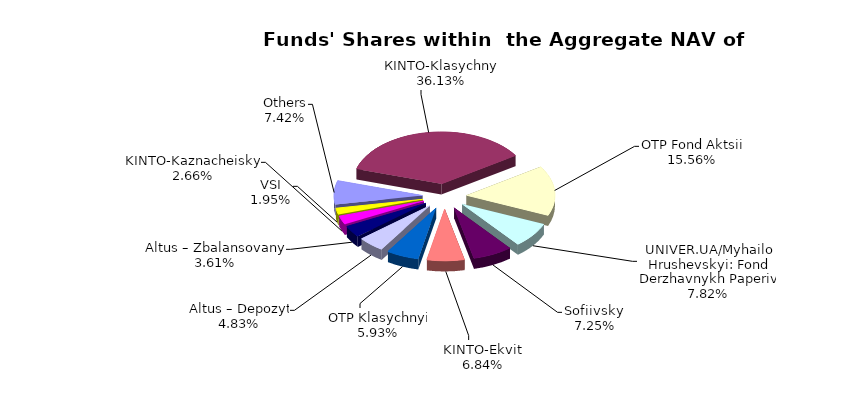
| Category | Series 0 | Series 1 |
|---|---|---|
| Others | 6300241.75 | 0.074 |
| КІNТО-Klasychnyi | 30672133.44 | 0.361 |
| ОТP Fond Aktsii | 13210324.31 | 0.156 |
| UNIVER.UA/Myhailo Hrushevskyi: Fond Derzhavnykh Paperiv | 6634987.03 | 0.078 |
| Sofiivskyi | 6151275.26 | 0.072 |
| KINTO-Ekviti | 5802265.29 | 0.068 |
| ОТP Klasychnyi | 5034856.93 | 0.059 |
| Altus – Depozyt | 4104064.07 | 0.048 |
| Altus – Zbalansovanyi | 3067413.33 | 0.036 |
| KINTO-Kaznacheiskyi | 2254050.9 | 0.027 |
| VSI | 1656856.55 | 0.02 |